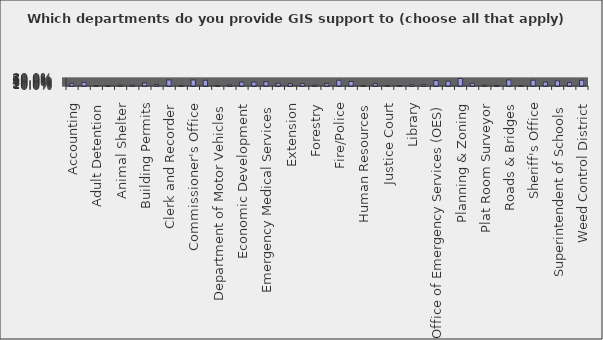
| Category | Series 0 |
|---|---|
| Accounting | 0.242 |
| Administration | 0.364 |
| Adult Detention | 0.03 |
| Agency On Aging | 0.03 |
| Animal Shelter | 0.091 |
| Auditor | 0.091 |
| Building Permits | 0.303 |
| Cemetery | 0.152 |
| Clerk and Recorder | 0.606 |
| Clerk of Court | 0.061 |
| Commissioner's Office | 0.606 |
| County Attorney | 0.576 |
| Department of Motor Vehicles | 0.061 |
| District Court | 0.121 |
| Economic Development | 0.394 |
| Election | 0.394 |
| Emergency Medical Services | 0.424 |
| Engineering | 0.273 |
| Extension | 0.242 |
| Fairgrounds | 0.242 |
| Forestry | 0.091 |
| Finance | 0.242 |
| Fire/Police | 0.576 |
| Health Department | 0.455 |
| Human Resources | 0.061 |
| Information Technology | 0.242 |
| Justice Court | 0.061 |
| Juvenile Detention | 0.03 |
| Library | 0.121 |
| Maintenance | 0.152 |
| Office of Emergency Services (OES) | 0.545 |
| Parks & Recreation | 0.485 |
| Planning & Zoning | 0.758 |
| Property Tax | 0.273 |
| Plat Room Surveyor | 0.091 |
| Public Administrator | 0.061 |
| Roads & Bridges | 0.606 |
| Retired and Senior Volunteer Program (RSVP) | 0.03 |
| Sheriff's Office | 0.576 |
| Solid Waste | 0.394 |
| Superintendent of Schools | 0.515 |
| Treasurer | 0.333 |
| Weed Control District | 0.576 |